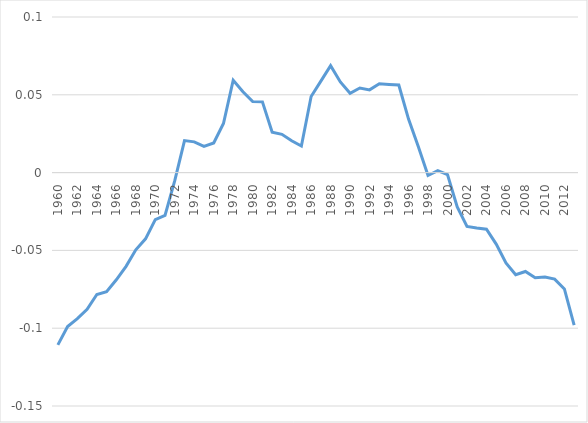
| Category | BC |
|---|---|
| 1960.0 | -0.111 |
| 1961.0 | -0.099 |
| 1962.0 | -0.094 |
| 1963.0 | -0.088 |
| 1964.0 | -0.078 |
| 1965.0 | -0.077 |
| 1966.0 | -0.069 |
| 1967.0 | -0.06 |
| 1968.0 | -0.05 |
| 1969.0 | -0.043 |
| 1970.0 | -0.03 |
| 1971.0 | -0.028 |
| 1972.0 | -0.005 |
| 1973.0 | 0.021 |
| 1974.0 | 0.02 |
| 1975.0 | 0.017 |
| 1976.0 | 0.019 |
| 1977.0 | 0.032 |
| 1978.0 | 0.059 |
| 1979.0 | 0.052 |
| 1980.0 | 0.046 |
| 1981.0 | 0.045 |
| 1982.0 | 0.026 |
| 1983.0 | 0.025 |
| 1984.0 | 0.02 |
| 1985.0 | 0.017 |
| 1986.0 | 0.049 |
| 1987.0 | 0.059 |
| 1988.0 | 0.069 |
| 1989.0 | 0.058 |
| 1990.0 | 0.051 |
| 1991.0 | 0.054 |
| 1992.0 | 0.053 |
| 1993.0 | 0.057 |
| 1994.0 | 0.057 |
| 1995.0 | 0.056 |
| 1996.0 | 0.034 |
| 1997.0 | 0.017 |
| 1998.0 | -0.002 |
| 1999.0 | 0.001 |
| 2000.0 | -0.001 |
| 2001.0 | -0.022 |
| 2002.0 | -0.035 |
| 2003.0 | -0.036 |
| 2004.0 | -0.036 |
| 2005.0 | -0.046 |
| 2006.0 | -0.058 |
| 2007.0 | -0.066 |
| 2008.0 | -0.064 |
| 2009.0 | -0.068 |
| 2010.0 | -0.067 |
| 2011.0 | -0.068 |
| 2012.0 | -0.075 |
| 2013.0 | -0.098 |